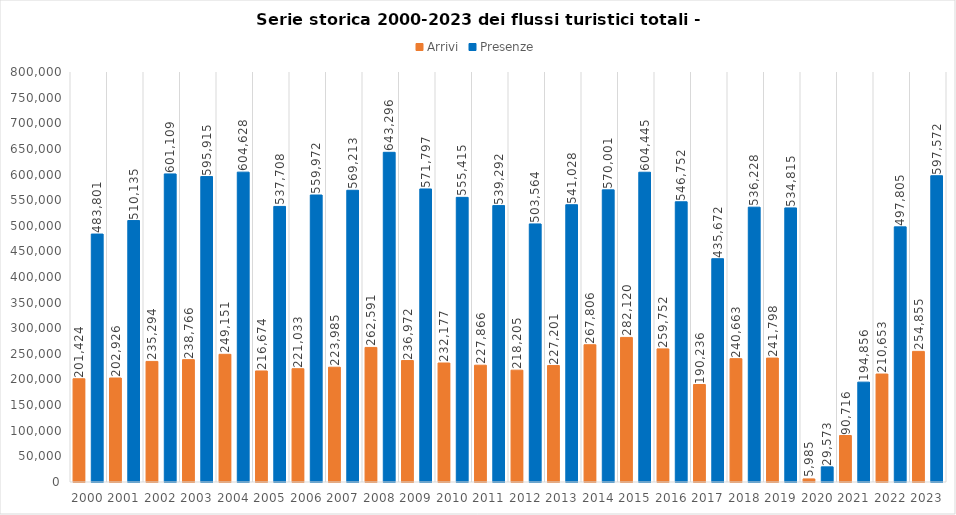
| Category | Arrivi | Presenze |
|---|---|---|
| 2000.0 | 201424 | 483801 |
| 2001.0 | 202926 | 510135 |
| 2002.0 | 235294 | 601109 |
| 2003.0 | 238766 | 595915 |
| 2004.0 | 249151 | 604628 |
| 2005.0 | 216674 | 537708 |
| 2006.0 | 221033 | 559972 |
| 2007.0 | 223985 | 569213 |
| 2008.0 | 262591 | 643296 |
| 2009.0 | 236972 | 571797 |
| 2010.0 | 232177 | 555415 |
| 2011.0 | 227866 | 539292 |
| 2012.0 | 218205 | 503564 |
| 2013.0 | 227201 | 541028 |
| 2014.0 | 267806 | 570001 |
| 2015.0 | 282120 | 604445 |
| 2016.0 | 259752 | 546752 |
| 2017.0 | 190236 | 435672 |
| 2018.0 | 240663 | 536228 |
| 2019.0 | 241798 | 534815 |
| 2020.0 | 5985 | 29573 |
| 2021.0 | 90716 | 194856 |
| 2022.0 | 210653 | 497805 |
| 2023.0 | 254855 | 597572 |